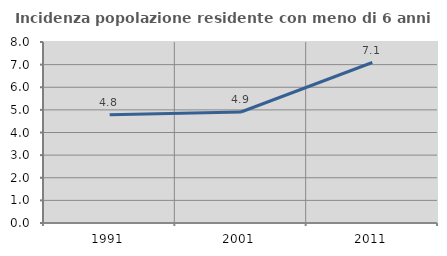
| Category | Incidenza popolazione residente con meno di 6 anni |
|---|---|
| 1991.0 | 4.784 |
| 2001.0 | 4.905 |
| 2011.0 | 7.093 |